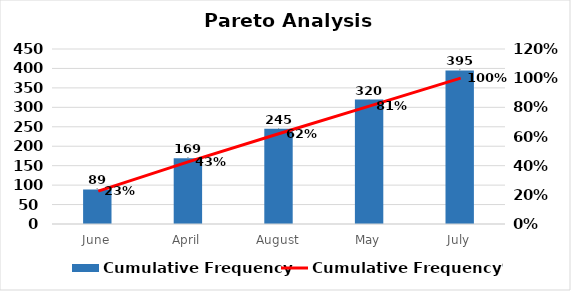
| Category | Cumulative Frequency |
|---|---|
| June | 89 |
| April | 169 |
| August | 245 |
| May | 320 |
| July | 395 |